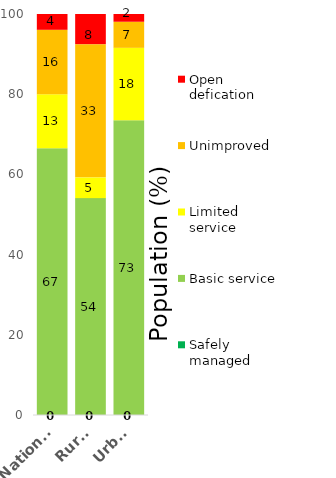
| Category | Safely managed | Basic service | Limited service | Unimproved | Open defication |
|---|---|---|---|---|---|
| National | 0 | 66.514 | 13.444 | 16.104 | 3.937 |
| Rural | 0 | 54.084 | 5.175 | 33.223 | 7.518 |
| Urban | 0 | 73.484 | 18.081 | 6.506 | 1.93 |